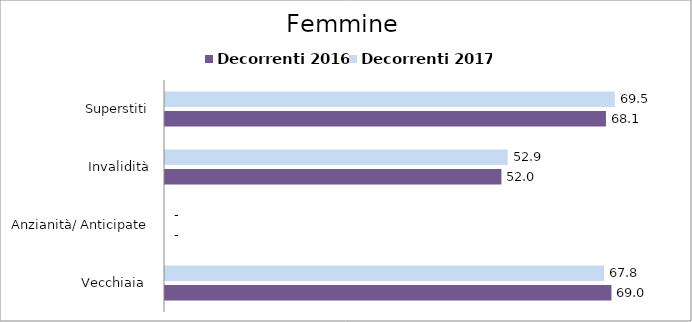
| Category | Decorrenti 2016 | Decorrenti 2017 |
|---|---|---|
| Vecchiaia  | 68.95 | 67.81 |
| Anzianità/ Anticipate | 0 | 0 |
| Invalidità | 51.96 | 52.93 |
| Superstiti | 68.1 | 69.47 |